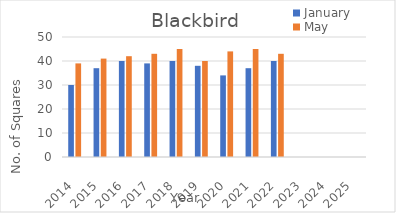
| Category | January | May |
|---|---|---|
| 2014.0 | 30 | 39 |
| 2015.0 | 37 | 41 |
| 2016.0 | 40 | 42 |
| 2017.0 | 39 | 43 |
| 2018.0 | 40 | 45 |
| 2019.0 | 38 | 40 |
| 2020.0 | 34 | 44 |
| 2021.0 | 37 | 45 |
| 2022.0 | 40 | 43 |
| 2023.0 | 0 | 0 |
| 2024.0 | 0 | 0 |
| 2025.0 | 0 | 0 |